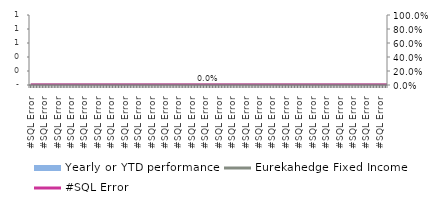
| Category | Yearly or YTD performance |
|---|---|
| 0.0 | 0 |